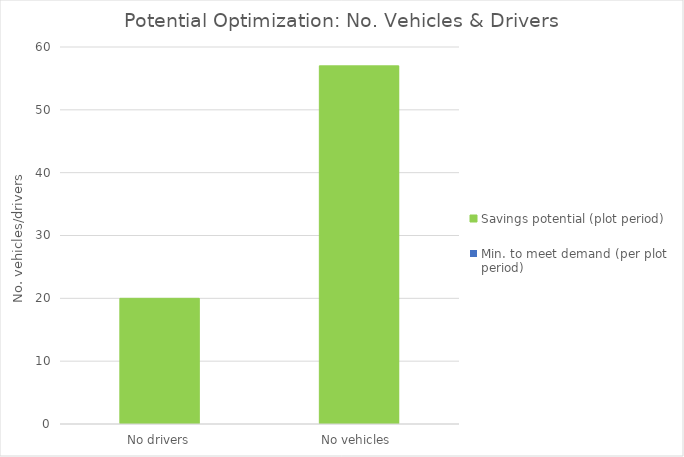
| Category | Min. to meet demand (per plot period) | Savings potential (plot period) |
|---|---|---|
| No drivers | 0 | 20 |
| No vehicles  | 0 | 57 |